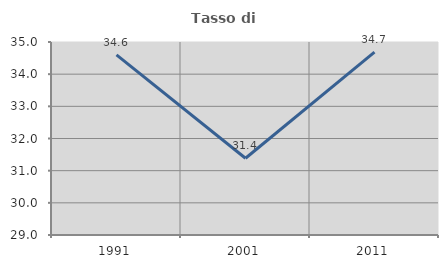
| Category | Tasso di occupazione   |
|---|---|
| 1991.0 | 34.601 |
| 2001.0 | 31.387 |
| 2011.0 | 34.684 |